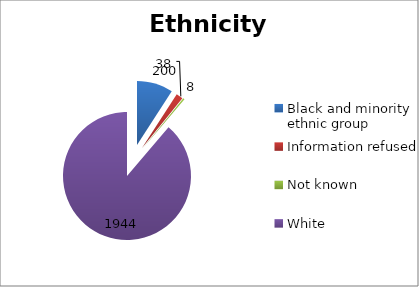
| Category | Number of people | Percentage |
|---|---|---|
| Black and minority ethnic group | 200 | 9.132 |
| Information refused | 38 | 1.735 |
| Not known | 8 | 0.365 |
| White | 1944 | 88.767 |